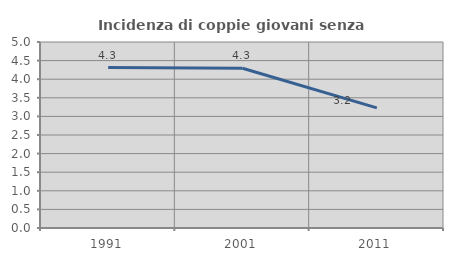
| Category | Incidenza di coppie giovani senza figli |
|---|---|
| 1991.0 | 4.311 |
| 2001.0 | 4.294 |
| 2011.0 | 3.231 |